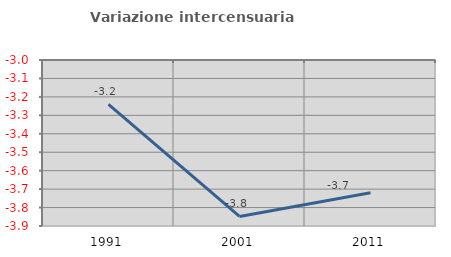
| Category | Variazione intercensuaria annua |
|---|---|
| 1991.0 | -3.241 |
| 2001.0 | -3.848 |
| 2011.0 | -3.72 |